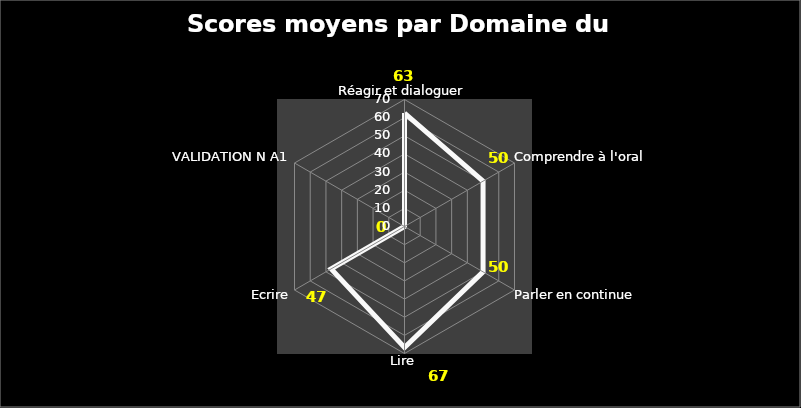
| Category | Series 0 |
|---|---|
| Réagir et dialoguer | 62.5 |
| Comprendre à l'oral | 50 |
| Parler en continue | 50 |
| Lire | 66.667 |
| Ecrire | 46.667 |
| VALIDATION N A1 | 0 |